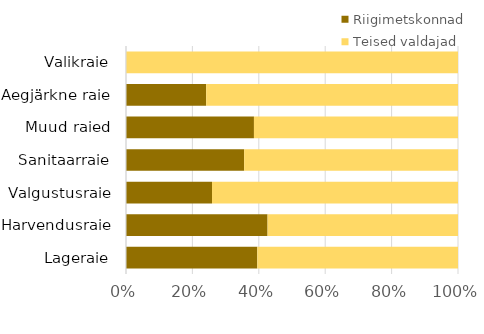
| Category | Riigimetskonnad | Teised valdajad |
|---|---|---|
| Lageraie | 3341.767 | 5108.301 |
| Harvendusraie | 609.744 | 820.186 |
| Valgustusraie | 5.633 | 16.111 |
| Sanitaarraie | 228.615 | 413.829 |
| Muud raied | 62.752 | 100.08 |
| Aegjärkne raie | 103.196 | 324.129 |
| Valikraie | 0 | 86.606 |